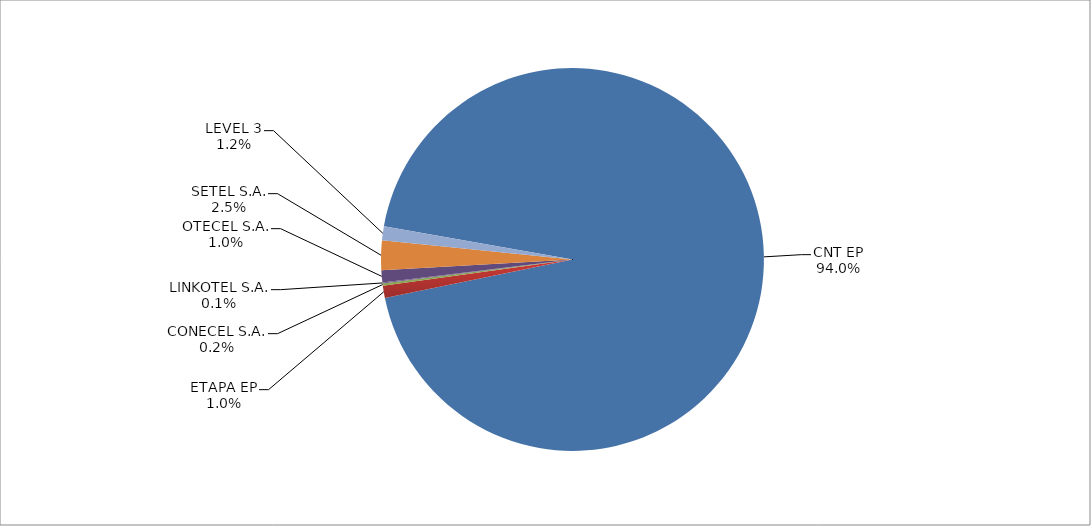
| Category | Series 0 |
|---|---|
| CNT EP | 2463 |
| ETAPA EP | 27 |
| CONECEL S.A. | 5 |
| LINKOTEL S.A. | 2 |
| OTECEL S.A. | 27 |
| SETEL S.A. | 65 |
| LEVEL 3 | 31 |